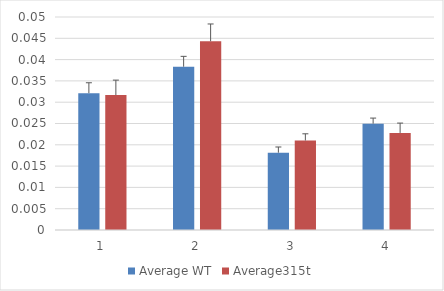
| Category | Average WT | Average315t |
|---|---|---|
| 0 | 0.032 | 0.032 |
| 1 | 0.038 | 0.044 |
| 2 | 0.018 | 0.021 |
| 3 | 0.025 | 0.023 |